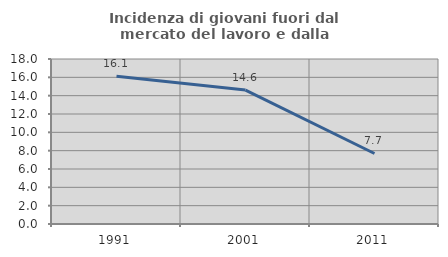
| Category | Incidenza di giovani fuori dal mercato del lavoro e dalla formazione  |
|---|---|
| 1991.0 | 16.129 |
| 2001.0 | 14.607 |
| 2011.0 | 7.692 |